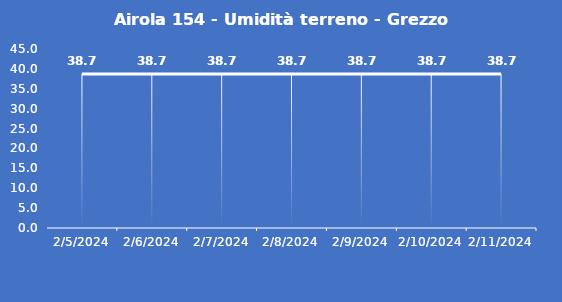
| Category | Airola 154 - Umidità terreno - Grezzo (%VWC) |
|---|---|
| 2/5/24 | 38.7 |
| 2/6/24 | 38.7 |
| 2/7/24 | 38.7 |
| 2/8/24 | 38.7 |
| 2/9/24 | 38.7 |
| 2/10/24 | 38.7 |
| 2/11/24 | 38.7 |